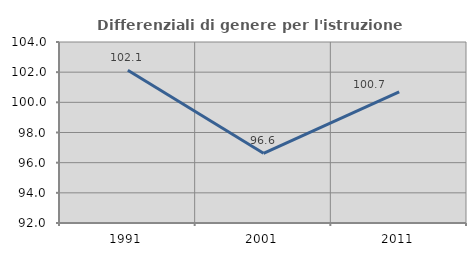
| Category | Differenziali di genere per l'istruzione superiore |
|---|---|
| 1991.0 | 102.125 |
| 2001.0 | 96.619 |
| 2011.0 | 100.689 |